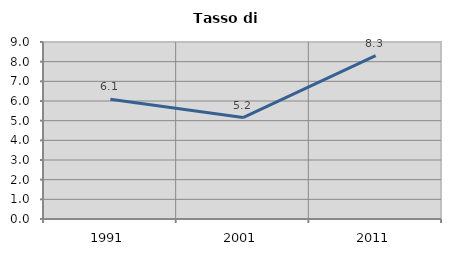
| Category | Tasso di disoccupazione   |
|---|---|
| 1991.0 | 6.094 |
| 2001.0 | 5.158 |
| 2011.0 | 8.312 |